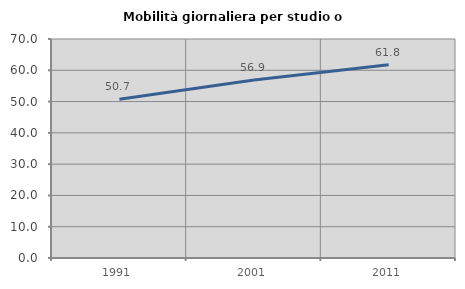
| Category | Mobilità giornaliera per studio o lavoro |
|---|---|
| 1991.0 | 50.712 |
| 2001.0 | 56.883 |
| 2011.0 | 61.785 |